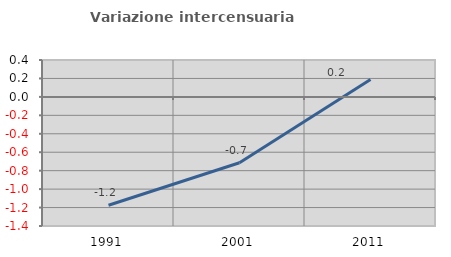
| Category | Variazione intercensuaria annua |
|---|---|
| 1991.0 | -1.174 |
| 2001.0 | -0.714 |
| 2011.0 | 0.188 |